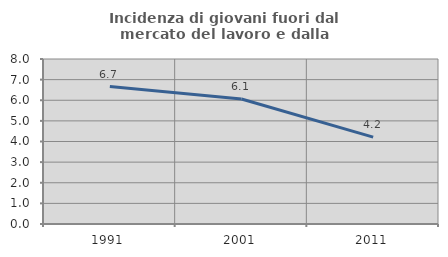
| Category | Incidenza di giovani fuori dal mercato del lavoro e dalla formazione  |
|---|---|
| 1991.0 | 6.667 |
| 2001.0 | 6.061 |
| 2011.0 | 4.211 |